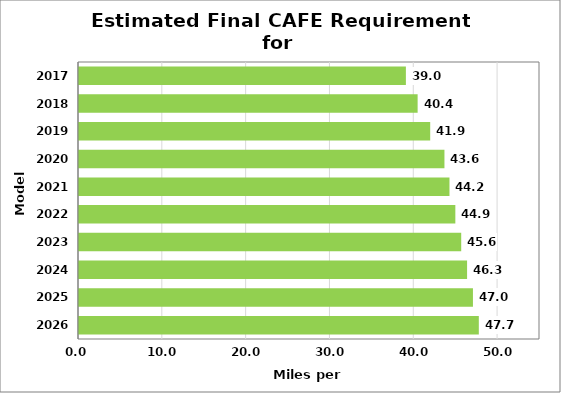
| Category | Series 1 |
|---|---|
| 2026.0 | 47.7 |
| 2025.0 | 47 |
| 2024.0 | 46.3 |
| 2023.0 | 45.6 |
| 2022.0 | 44.9 |
| 2021.0 | 44.2 |
| 2020.0 | 43.6 |
| 2019.0 | 41.9 |
| 2018.0 | 40.4 |
| 2017.0 | 39 |